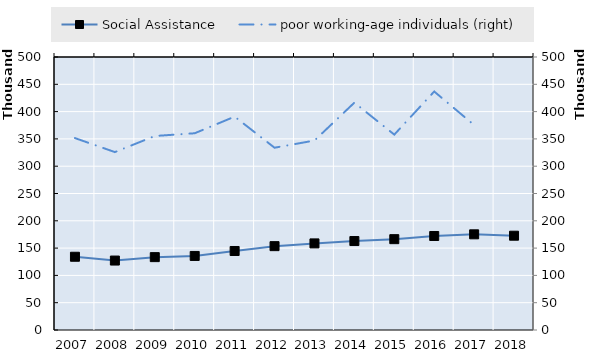
| Category | Social Assistance | Survivors' pension from occupational accident insurance | 0 | Series 14 | Series 15 | Series 16 | Series 17 | Series 18 | Series 19 |
|---|---|---|---|---|---|---|---|---|---|
| 2007.0 | 134146.591 |  |  |  |  |  |  |  |  |
| 2008.0 | 127189.065 |  |  |  |  |  |  |  |  |
| 2009.0 | 133463 |  |  |  |  |  |  |  |  |
| 2010.0 | 135618 |  |  |  |  |  |  |  |  |
| 2011.0 | 144717 |  |  |  |  |  |  |  |  |
| 2012.0 | 153586 |  |  |  |  |  |  |  |  |
| 2013.0 | 158600 |  |  |  |  |  |  |  |  |
| 2014.0 | 162935 |  |  |  |  |  |  |  |  |
| 2015.0 | 166372 |  |  |  |  |  |  |  |  |
| 2016.0 | 172181 |  |  |  |  |  |  |  |  |
| 2017.0 | 175241 |  |  |  |  |  |  |  |  |
| 2018.0 | 172693 |  |  |  |  |  |  |  |  |